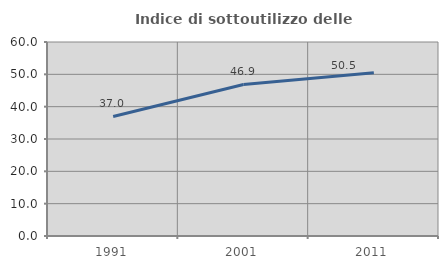
| Category | Indice di sottoutilizzo delle abitazioni  |
|---|---|
| 1991.0 | 36.967 |
| 2001.0 | 46.861 |
| 2011.0 | 50.493 |